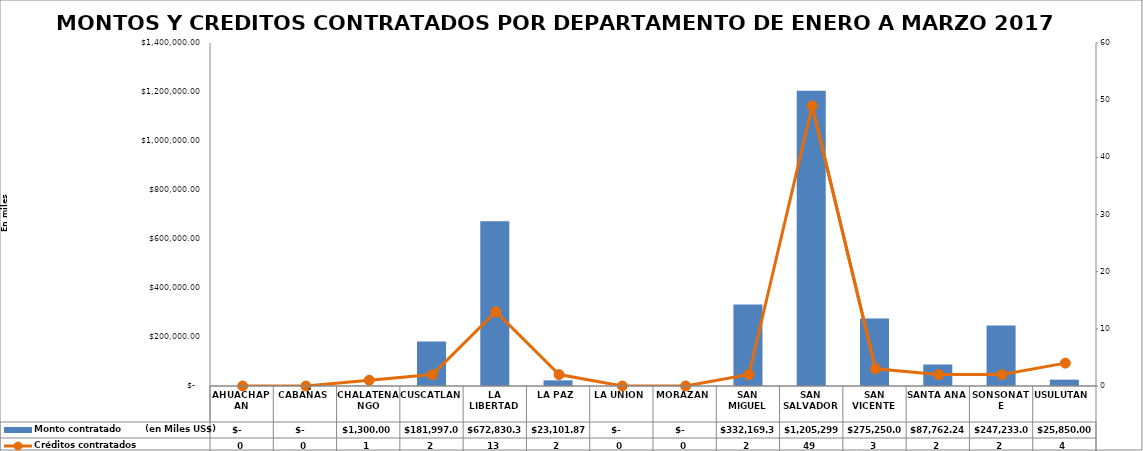
| Category | Monto contratado        (en Miles US$) |
|---|---|
| AHUACHAPAN | 0 |
| CABAÑAS | 0 |
| CHALATENANGO | 1300 |
| CUSCATLAN | 181997 |
| LA LIBERTAD | 672830.37 |
| LA PAZ | 23101.87 |
| LA UNION | 0 |
| MORAZAN | 0 |
| SAN MIGUEL | 332169.3 |
| SAN SALVADOR | 1205299.67 |
| SAN VICENTE | 275250 |
| SANTA ANA | 87762.24 |
| SONSONATE | 247233 |
| USULUTAN | 25850 |